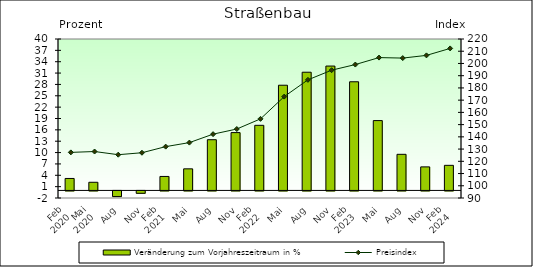
| Category | Veränderung zum Vorjahreszeitraum in % |
|---|---|
| 0 | 3.16 |
| 1 | 2.155 |
| 2 | -1.493 |
| 3 | -0.626 |
| 4 | 3.692 |
| 5 | 5.703 |
| 6 | 13.397 |
| 7 | 15.276 |
| 8 | 17.197 |
| 9 | 27.79 |
| 10 | 31.224 |
| 11 | 32.855 |
| 12 | 28.701 |
| 13 | 18.45 |
| 14 | 9.539 |
| 15 | 6.221 |
| 16 | 6.63 |